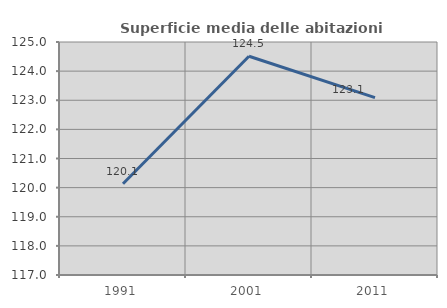
| Category | Superficie media delle abitazioni occupate |
|---|---|
| 1991.0 | 120.133 |
| 2001.0 | 124.51 |
| 2011.0 | 123.092 |